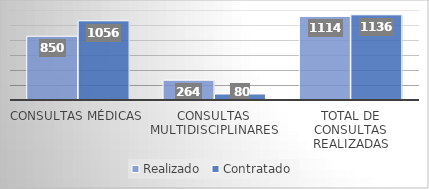
| Category | Realizado | Contratado |
|---|---|---|
| Consultas Médicas | 850 | 1056 |
| Consultas Multidisciplinares | 264 | 80 |
| Total de Consultas Realizadas | 1114 | 1136 |